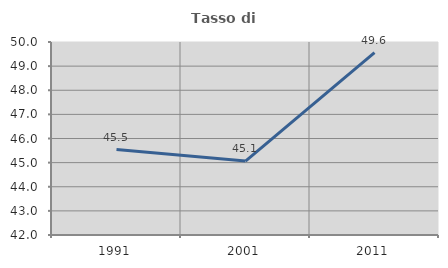
| Category | Tasso di occupazione   |
|---|---|
| 1991.0 | 45.543 |
| 2001.0 | 45.066 |
| 2011.0 | 49.56 |